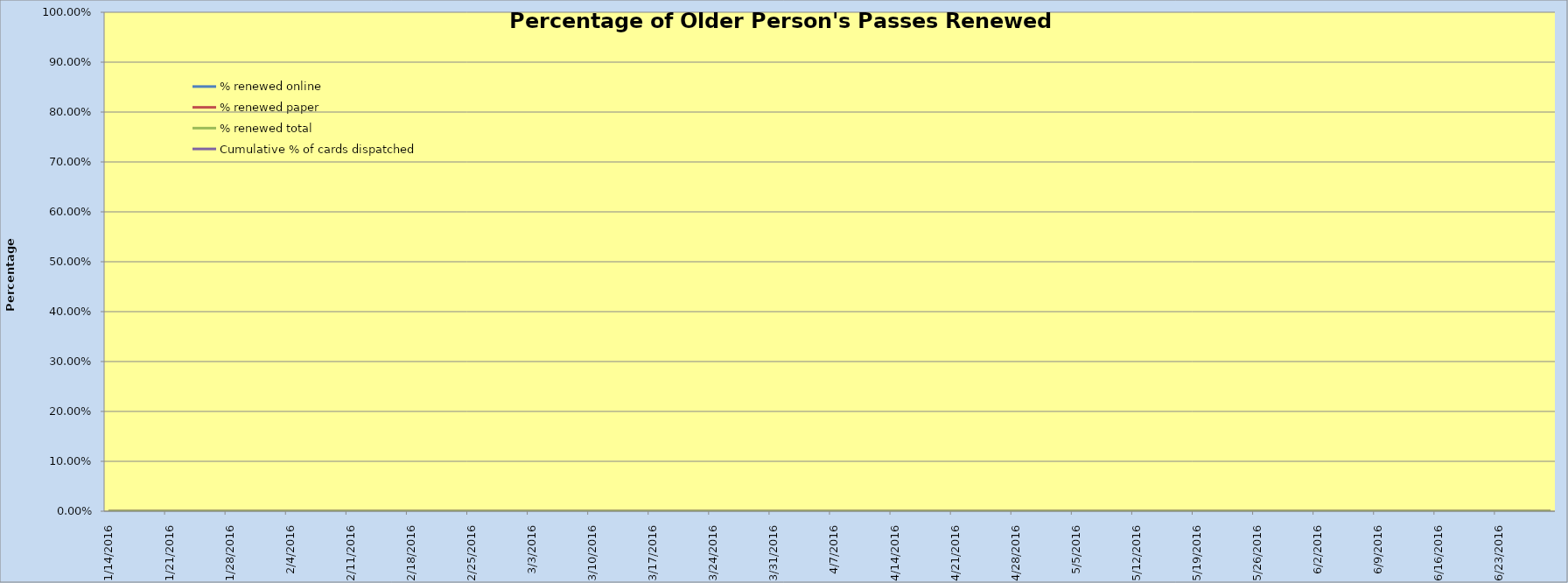
| Category | % renewed online | % renewed paper | % renewed total | Cumulative % of cards dispatched  |
|---|---|---|---|---|
| 1/14/16 | 0 | 0 | 0 |  |
| 1/15/16 | 0 | 0 | 0 |  |
| 1/16/16 | 0 | 0 | 0 |  |
| 1/17/16 | 0 | 0 | 0 |  |
| 1/18/16 | 0 | 0 | 0 |  |
| 1/19/16 | 0 | 0 | 0 |  |
| 1/20/16 | 0 | 0 | 0 |  |
| 1/21/16 | 0 | 0 | 0 |  |
| 1/22/16 | 0 | 0 | 0 |  |
| 1/23/16 | 0 | 0 | 0 |  |
| 1/24/16 | 0 | 0 | 0 |  |
| 1/25/16 | 0 | 0 | 0 |  |
| 1/26/16 | 0 | 0 | 0 |  |
| 1/27/16 | 0 | 0 | 0 |  |
| 1/28/16 | 0 | 0 | 0 |  |
| 1/29/16 | 0 | 0 | 0 |  |
| 1/30/16 | 0 | 0 | 0 |  |
| 1/31/16 | 0 | 0 | 0 |  |
| 2/1/16 | 0 | 0 | 0 |  |
| 2/2/16 | 0 | 0 | 0 |  |
| 2/3/16 | 0 | 0 | 0 |  |
| 2/4/16 | 0 | 0 | 0 |  |
| 2/5/16 | 0 | 0 | 0 |  |
| 2/6/16 | 0 | 0 | 0 |  |
| 2/7/16 | 0 | 0 | 0 |  |
| 2/8/16 | 0 | 0 | 0 |  |
| 2/9/16 | 0 | 0 | 0 |  |
| 2/10/16 | 0 | 0 | 0 |  |
| 2/11/16 | 0 | 0 | 0 |  |
| 2/12/16 | 0 | 0 | 0 |  |
| 2/13/16 | 0 | 0 | 0 |  |
| 2/14/16 | 0 | 0 | 0 |  |
| 2/15/16 | 0 | 0 | 0 |  |
| 2/16/16 | 0 | 0 | 0 |  |
| 2/17/16 | 0 | 0 | 0 |  |
| 2/18/16 | 0 | 0 | 0 |  |
| 2/19/16 | 0 | 0 | 0 |  |
| 2/20/16 | 0 | 0 | 0 |  |
| 2/21/16 | 0 | 0 | 0 |  |
| 2/22/16 | 0 | 0 | 0 |  |
| 2/23/16 | 0 | 0 | 0 |  |
| 2/24/16 | 0 | 0 | 0 |  |
| 2/25/16 | 0 | 0 | 0 |  |
| 2/26/16 | 0 | 0 | 0 |  |
| 2/27/16 | 0 | 0 | 0 |  |
| 2/28/16 | 0 | 0 | 0 |  |
| 2/29/16 | 0 | 0 | 0 |  |
| 3/1/16 | 0 | 0 | 0 |  |
| 3/2/16 | 0 | 0 | 0 |  |
| 3/3/16 | 0 | 0 | 0 |  |
| 3/4/16 | 0 | 0 | 0 |  |
| 3/5/16 | 0 | 0 | 0 |  |
| 3/6/16 | 0 | 0 | 0 |  |
| 3/7/16 | 0 | 0 | 0 |  |
| 3/8/16 | 0 | 0 | 0 |  |
| 3/9/16 | 0 | 0 | 0 |  |
| 3/10/16 | 0 | 0 | 0 |  |
| 3/11/16 | 0 | 0 | 0 |  |
| 3/12/16 | 0 | 0 | 0 |  |
| 3/13/16 | 0 | 0 | 0 |  |
| 3/14/16 | 0 | 0 | 0 |  |
| 3/15/16 | 0 | 0 | 0 |  |
| 3/16/16 | 0 | 0 | 0 |  |
| 3/17/16 | 0 | 0 | 0 |  |
| 3/18/16 | 0 | 0 | 0 |  |
| 3/19/16 | 0 | 0 | 0 |  |
| 3/20/16 | 0 | 0 | 0 |  |
| 3/21/16 | 0 | 0 | 0 |  |
| 3/22/16 | 0 | 0 | 0 |  |
| 3/23/16 | 0 | 0 | 0 |  |
| 3/24/16 | 0 | 0 | 0 |  |
| 3/25/16 | 0 | 0 | 0 |  |
| 3/26/16 | 0 | 0 | 0 |  |
| 3/27/16 | 0 | 0 | 0 |  |
| 3/28/16 | 0 | 0 | 0 |  |
| 3/29/16 | 0 | 0 | 0 |  |
| 3/30/16 | 0 | 0 | 0 |  |
| 3/31/16 | 0 | 0 | 0 |  |
| 4/1/16 | 0 | 0 | 0 |  |
| 4/2/16 | 0 | 0 | 0 |  |
| 4/3/16 | 0 | 0 | 0 |  |
| 4/4/16 | 0 | 0 | 0 |  |
| 4/5/16 | 0 | 0 | 0 |  |
| 4/6/16 | 0 | 0 | 0 |  |
| 4/7/16 | 0 | 0 | 0 |  |
| 4/8/16 | 0 | 0 | 0 |  |
| 4/9/16 | 0 | 0 | 0 |  |
| 4/10/16 | 0 | 0 | 0 |  |
| 4/11/16 | 0 | 0 | 0 |  |
| 4/12/16 | 0 | 0 | 0 |  |
| 4/13/16 | 0 | 0 | 0 |  |
| 4/14/16 | 0 | 0 | 0 |  |
| 4/15/16 | 0 | 0 | 0 |  |
| 4/16/16 | 0 | 0 | 0 |  |
| 4/17/16 | 0 | 0 | 0 |  |
| 4/18/16 | 0 | 0 | 0 |  |
| 4/19/16 | 0 | 0 | 0 |  |
| 4/20/16 | 0 | 0 | 0 |  |
| 4/21/16 | 0 | 0 | 0 |  |
| 4/22/16 | 0 | 0 | 0 |  |
| 4/23/16 | 0 | 0 | 0 |  |
| 4/24/16 | 0 | 0 | 0 |  |
| 4/25/16 | 0 | 0 | 0 |  |
| 4/26/16 | 0 | 0 | 0 |  |
| 4/27/16 | 0 | 0 | 0 |  |
| 4/28/16 | 0 | 0 | 0 |  |
| 4/29/16 | 0 | 0 | 0 |  |
| 4/30/16 | 0 | 0 | 0 |  |
| 5/1/16 | 0 | 0 | 0 |  |
| 5/2/16 | 0 | 0 | 0 |  |
| 5/3/16 | 0 | 0 | 0 |  |
| 5/4/16 | 0 | 0 | 0 |  |
| 5/5/16 | 0 | 0 | 0 |  |
| 5/6/16 | 0 | 0 | 0 |  |
| 5/7/16 | 0 | 0 | 0 |  |
| 5/8/16 | 0 | 0 | 0 |  |
| 5/9/16 | 0 | 0 | 0 |  |
| 5/10/16 | 0 | 0 | 0 |  |
| 5/11/16 | 0 | 0 | 0 |  |
| 5/12/16 | 0 | 0 | 0 |  |
| 5/13/16 | 0 | 0 | 0 |  |
| 5/14/16 | 0 | 0 | 0 |  |
| 5/15/16 | 0 | 0 | 0 |  |
| 5/16/16 | 0 | 0 | 0 |  |
| 5/17/16 | 0 | 0 | 0 |  |
| 5/18/16 | 0 | 0 | 0 |  |
| 5/19/16 | 0 | 0 | 0 |  |
| 5/20/16 | 0 | 0 | 0 |  |
| 5/21/16 | 0 | 0 | 0 |  |
| 5/22/16 | 0 | 0 | 0 |  |
| 5/23/16 | 0 | 0 | 0 |  |
| 5/24/16 | 0 | 0 | 0 |  |
| 5/25/16 | 0 | 0 | 0 |  |
| 5/26/16 | 0 | 0 | 0 |  |
| 5/27/16 | 0 | 0 | 0 |  |
| 5/28/16 | 0 | 0 | 0 |  |
| 5/29/16 | 0 | 0 | 0 |  |
| 5/30/16 | 0 | 0 | 0 |  |
| 5/31/16 | 0 | 0 | 0 |  |
| 6/1/16 | 0 | 0 | 0 |  |
| 6/2/16 | 0 | 0 | 0 |  |
| 6/3/16 | 0 | 0 | 0 |  |
| 6/4/16 | 0 | 0 | 0 |  |
| 6/5/16 | 0 | 0 | 0 |  |
| 6/6/16 | 0 | 0 | 0 |  |
| 6/7/16 | 0 | 0 | 0 |  |
| 6/8/16 | 0 | 0 | 0 |  |
| 6/9/16 | 0 | 0 | 0 |  |
| 6/10/16 | 0 | 0 | 0 |  |
| 6/11/16 | 0 | 0 | 0 |  |
| 6/12/16 | 0 | 0 | 0 |  |
| 6/13/16 | 0 | 0 | 0 |  |
| 6/14/16 | 0 | 0 | 0 |  |
| 6/15/16 | 0 | 0 | 0 |  |
| 6/16/16 | 0 | 0 | 0 |  |
| 6/17/16 | 0 | 0 | 0 |  |
| 6/18/16 | 0 | 0 | 0 |  |
| 6/19/16 | 0 | 0 | 0 |  |
| 6/20/16 | 0 | 0 | 0 |  |
| 6/21/16 | 0 | 0 | 0 |  |
| 6/22/16 | 0 | 0 | 0 |  |
| 6/23/16 | 0 | 0 | 0 |  |
| 6/24/16 | 0 | 0 | 0 |  |
| 6/25/16 | 0 | 0 | 0 |  |
| 6/26/16 | 0 | 0 | 0 |  |
| 6/27/16 | 0 | 0 | 0 |  |
| 6/28/16 | 0 | 0 | 0 |  |
| 6/29/16 | 0 | 0 | 0 |  |